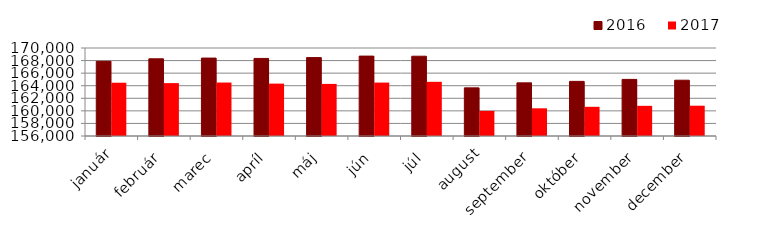
| Category | 2016 | 2017 |
|---|---|---|
| január | 167880 | 164477 |
| február | 168282 | 164414 |
| marec | 168395 | 164505 |
| apríl | 168341 | 164334 |
| máj | 168475 | 164288 |
| jún | 168710 | 164499 |
| júl | 168693 | 164621 |
| august | 163661 | 159992 |
| september | 164458 | 160407 |
| október | 164689 | 160645 |
| november | 165005 | 160799 |
| december | 164875 | 160820 |